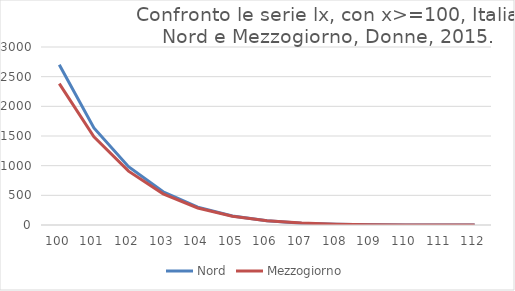
| Category | Nord | Mezzogiorno |
|---|---|---|
| 100.0 | 2700 | 2382 |
| 101.0 | 1636 | 1486 |
| 102.0 | 983 | 907 |
| 103.0 | 560 | 525 |
| 104.0 | 300 | 287 |
| 105.0 | 151 | 147 |
| 106.0 | 71 | 71 |
| 107.0 | 31 | 32 |
| 108.0 | 13 | 13 |
| 109.0 | 5 | 5 |
| 110.0 | 2 | 2 |
| 111.0 | 1 | 1 |
| 112.0 | 0 | 0 |